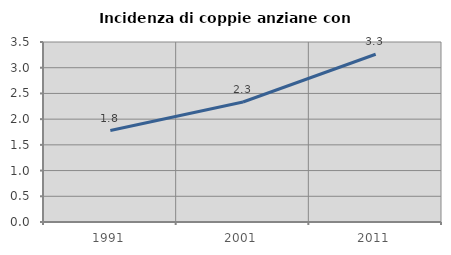
| Category | Incidenza di coppie anziane con figli |
|---|---|
| 1991.0 | 1.778 |
| 2001.0 | 2.334 |
| 2011.0 | 3.262 |